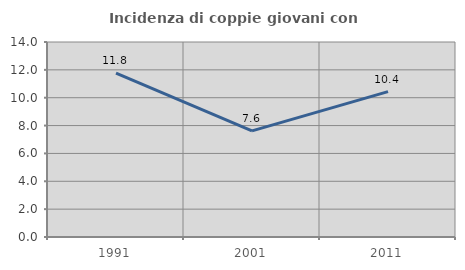
| Category | Incidenza di coppie giovani con figli |
|---|---|
| 1991.0 | 11.765 |
| 2001.0 | 7.616 |
| 2011.0 | 10.435 |